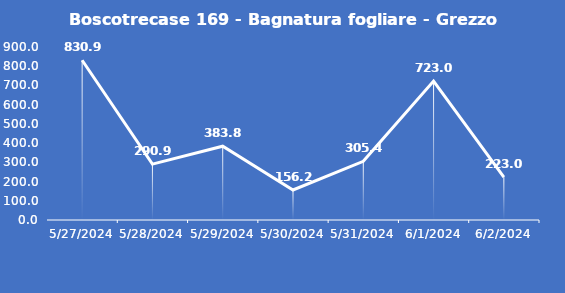
| Category | Boscotrecase 169 - Bagnatura fogliare - Grezzo (min) |
|---|---|
| 5/27/24 | 830.9 |
| 5/28/24 | 290.9 |
| 5/29/24 | 383.8 |
| 5/30/24 | 156.2 |
| 5/31/24 | 305.4 |
| 6/1/24 | 723 |
| 6/2/24 | 223 |